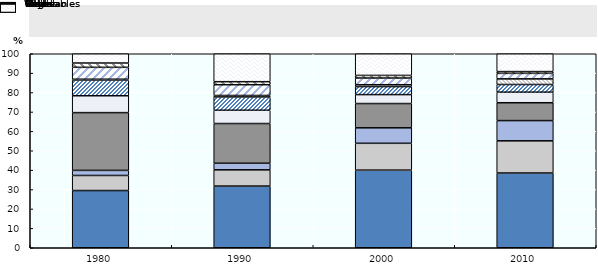
| Category | Meat | Vegetables | Fruits | Rice | Corn | Cotton | Milk | Wheat | Soybean | Other |
|---|---|---|---|---|---|---|---|---|---|---|
| 1980.0 | 29.493 | 7.77 | 2.616 | 29.775 | 8.7 | 8.107 | 0.419 | 6.128 | 2.216 | 4.777 |
| 1990.0 | 31.792 | 8.377 | 3.393 | 20.47 | 6.836 | 6.858 | 0.775 | 5.539 | 1.56 | 14.399 |
| 2000.0 | 40.012 | 13.83 | 7.983 | 12.509 | 4.608 | 4.138 | 0.95 | 3.459 | 1.345 | 11.166 |
| 2010.0 | 38.526 | 16.59 | 10.436 | 9.204 | 5.447 | 3.95 | 2.9 | 2.824 | 0.93 | 9.193 |